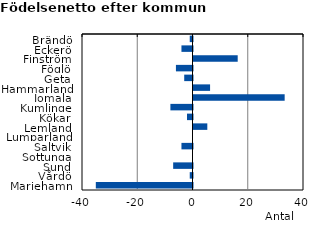
| Category | Series 0 |
|---|---|
| Brändö | -1 |
| Eckerö | -4 |
| Finström | 16 |
| Föglö | -6 |
| Geta | -3 |
| Hammarland | 6 |
| Jomala | 33 |
| Kumlinge | -8 |
| Kökar | -2 |
| Lemland | 5 |
| Lumparland | 0 |
| Saltvik | -4 |
| Sottunga | 0 |
| Sund | -7 |
| Vårdö | -1 |
| Mariehamn | -35 |